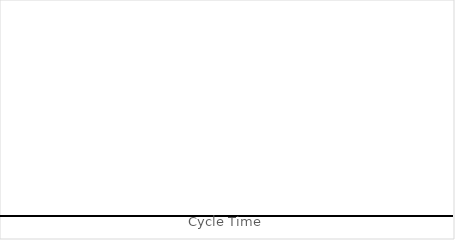
| Category | Activity |
|---|---|
| 1.0 | 0 |
| 2.0 | 0 |
| 3.0 | 0 |
| 4.0 | 0 |
| 5.0 | 0 |
| 6.0 | 0 |
| 7.0 | 0 |
| 8.0 | 0 |
| 9.0 | 0 |
| 10.0 | 0 |
| 11.0 | 0 |
| 12.0 | 0 |
| 13.0 | 0 |
| 14.0 | 0 |
| 15.0 | 0 |
| 16.0 | 0 |
| 17.0 | 0 |
| 18.0 | 0 |